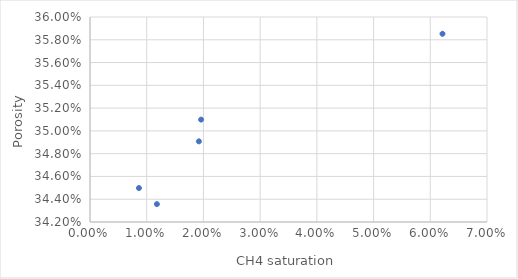
| Category | Series 0 |
|---|---|
| 0.06215328400276559 | 0.359 |
| 0.019588667645420728 | 0.351 |
| 0.019198889813149475 | 0.349 |
| 0.011794096149502132 | 0.344 |
| 0.008631637122717162 | 0.345 |